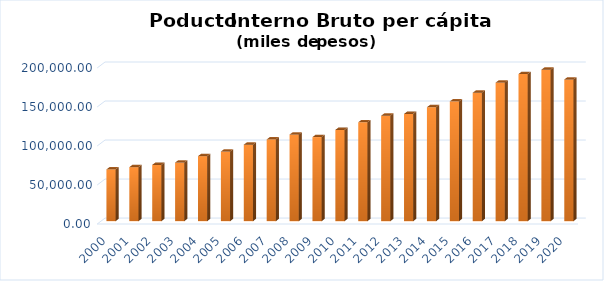
| Category | PIB per cápita |
|---|---|
| 2000.0 | 66346.623 |
| 2001.0 | 69224.622 |
| 2002.0 | 72090.576 |
| 2003.0 | 75141.499 |
| 2004.0 | 83324.556 |
| 2005.0 | 89244.591 |
| 2006.0 | 98063.412 |
| 2007.0 | 104785.037 |
| 2008.0 | 110996.897 |
| 2009.0 | 107775.66 |
| 2010.0 | 116986.672 |
| 2011.0 | 126773.971 |
| 2012.0 | 135132.404 |
| 2013.0 | 137481.986 |
| 2014.0 | 146051.606 |
| 2015.0 | 153481.131 |
| 2016.0 | 164623.257 |
| 2017.0 | 177578.326 |
| 2018.0 | 188590.727 |
| 2019.0 | 194187.06 |
| 2020.0 | 181551.884 |